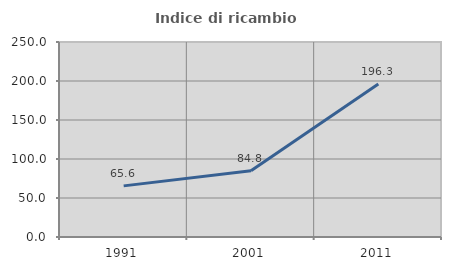
| Category | Indice di ricambio occupazionale  |
|---|---|
| 1991.0 | 65.556 |
| 2001.0 | 84.848 |
| 2011.0 | 196.296 |